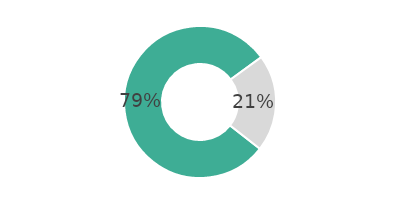
| Category | Series 0 |
|---|---|
| 0 | 79.386 |
| 1 | 20.614 |